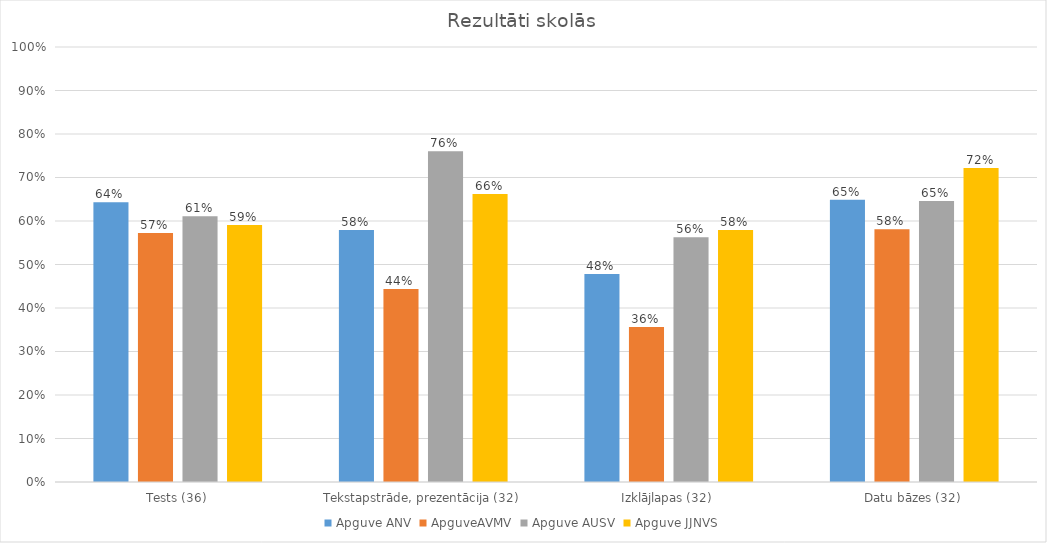
| Category | Apguve ANV | ApguveAVMV | Apguve AUSV | Apguve JJNVS |
|---|---|---|---|---|
| Tests (36) | 0.643 | 0.572 | 0.611 | 0.591 |
| Tekstapstrāde, prezentācija (32) | 0.579 | 0.444 | 0.76 | 0.662 |
| Izklājlapas (32) | 0.478 | 0.356 | 0.562 | 0.58 |
| Datu bāzes (32) | 0.649 | 0.581 | 0.646 | 0.722 |